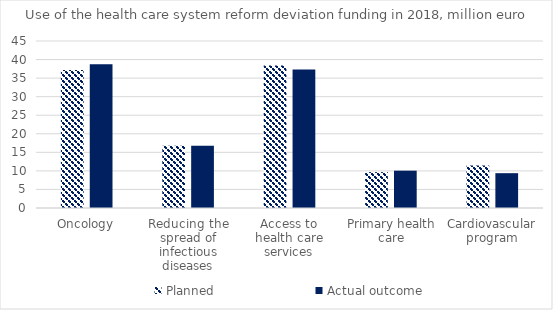
| Category | Planned | Actual outcome |
|---|---|---|
| Oncology | 37163269 | 38756386 |
| Reducing the spread of infectious diseases | 16740741 | 16740741 |
| Access to health care services | 38373824 | 37353637 |
| Primary health care | 9664036 | 10058853 |
| Cardiovascular program | 11458130 | 9382962 |